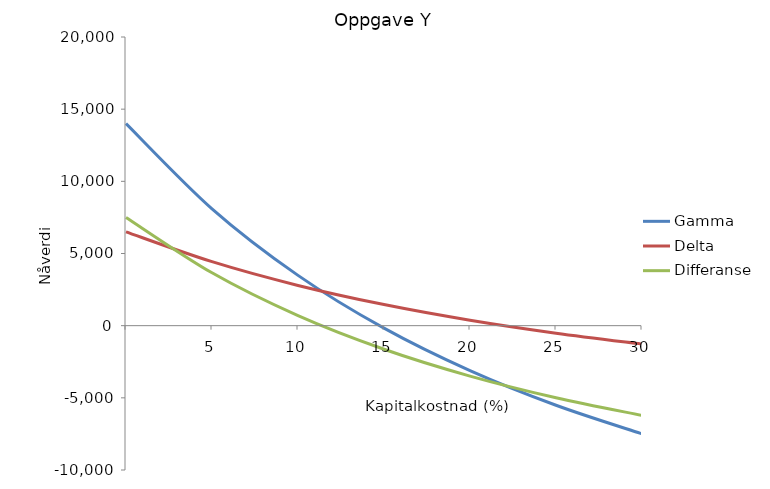
| Category | Gamma | Delta | Differanse |
|---|---|---|---|
| nan | 14000 | 6500 | 7500 |
| 5.0 | 8095.551 | 4432.569 | 3662.982 |
| 10.0 | 3484.67 | 2788.406 | 696.264 |
| 15.000000000000002 | -173.178 | 1461.266 | -1634.444 |
| 20.0 | -3116.62 | 375.611 | -3492.23 |
| 25.0 | -5516.032 | -523.264 | -4992.768 |
| 30.0 | -7495.16 | -1275.649 | -6219.511 |